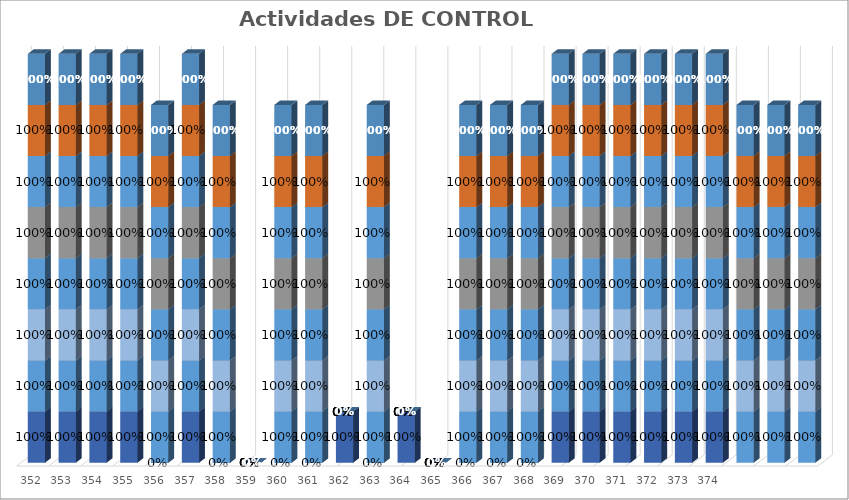
| Category | % Avance |
|---|---|
| 352.0 | 1 |
| 353.0 | 1 |
| 354.0 | 1 |
| 355.0 | 1 |
| 356.0 | 1 |
| 357.0 | 1 |
| 358.0 | 1 |
| 359.0 | 0 |
| 360.0 | 1 |
| 361.0 | 1 |
| 362.0 | 0 |
| 363.0 | 1 |
| 364.0 | 0 |
| 365.0 | 0 |
| 366.0 | 1 |
| 367.0 | 1 |
| 368.0 | 1 |
| 369.0 | 1 |
| 370.0 | 1 |
| 371.0 | 1 |
| 372.0 | 1 |
| 373.0 | 1 |
| 374.0 | 1 |